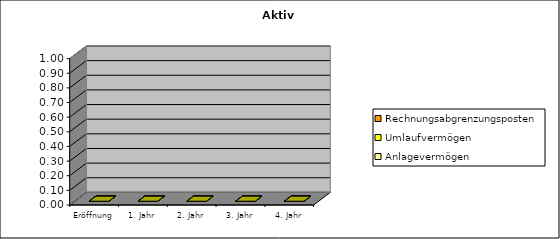
| Category | Anlagevermögen | Umlaufvermögen | Rechnungsabgrenzungsposten |
|---|---|---|---|
| Eröffnung | 0 | 0 | 0 |
| 1. Jahr | 0 | 0 | 0 |
| 2. Jahr | 0 | 0 | 0 |
| 3. Jahr | 0 | 0 | 0 |
| 4. Jahr | 0 | 0 | 0 |